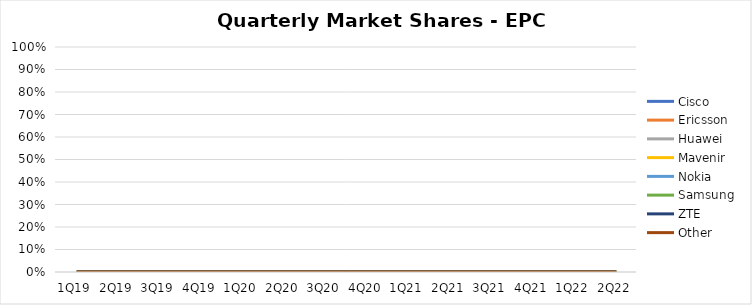
| Category | Cisco | Ericsson | Huawei | Mavenir | Nokia | Samsung | ZTE | Other |
|---|---|---|---|---|---|---|---|---|
| 1Q19 | 0 | 0 | 0 | 0 | 0 | 0 | 0 | 0 |
| 2Q19 | 0 | 0 | 0 | 0 | 0 | 0 | 0 | 0 |
| 3Q19 | 0 | 0 | 0 | 0 | 0 | 0 | 0 | 0 |
| 4Q19 | 0 | 0 | 0 | 0 | 0 | 0 | 0 | 0 |
| 1Q20 | 0 | 0 | 0 | 0 | 0 | 0 | 0 | 0 |
| 2Q20 | 0 | 0 | 0 | 0 | 0 | 0 | 0 | 0 |
| 3Q20 | 0 | 0 | 0 | 0 | 0 | 0 | 0 | 0 |
| 4Q20 | 0 | 0 | 0 | 0 | 0 | 0 | 0 | 0 |
| 1Q21 | 0 | 0 | 0 | 0 | 0 | 0 | 0 | 0 |
| 2Q21 | 0 | 0 | 0 | 0 | 0 | 0 | 0 | 0 |
| 3Q21 | 0 | 0 | 0 | 0 | 0 | 0 | 0 | 0 |
| 4Q21 | 0 | 0 | 0 | 0 | 0 | 0 | 0 | 0 |
| 1Q22 | 0 | 0 | 0 | 0 | 0 | 0 | 0 | 0 |
| 2Q22 | 0 | 0 | 0 | 0 | 0 | 0 | 0 | 0 |